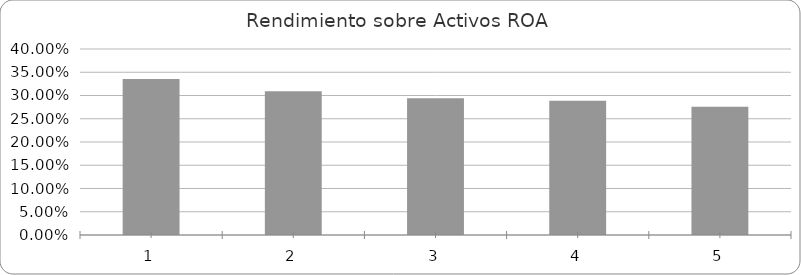
| Category | Series 0 |
|---|---|
| 0 | 0.335 |
| 1 | 0.309 |
| 2 | 0.294 |
| 3 | 0.289 |
| 4 | 0.276 |